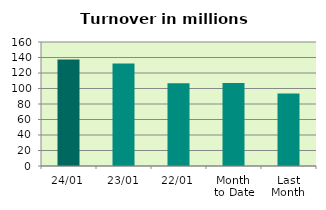
| Category | Series 0 |
|---|---|
| 24/01 | 137.313 |
| 23/01 | 132.272 |
| 22/01 | 106.831 |
| Month 
to Date | 106.951 |
| Last
Month | 93.592 |